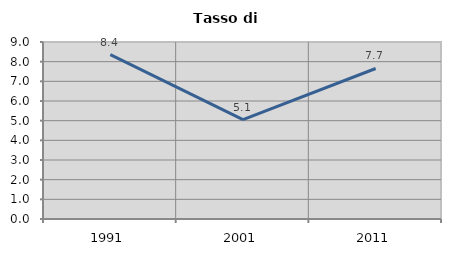
| Category | Tasso di disoccupazione   |
|---|---|
| 1991.0 | 8.36 |
| 2001.0 | 5.051 |
| 2011.0 | 7.653 |